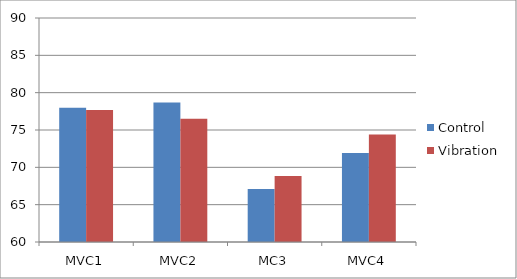
| Category | Control | Vibration |
|---|---|---|
| MVC1 | 77.965 | 77.668 |
| MVC2 | 78.669 | 76.519 |
| MC3 | 67.1 | 68.825 |
| MVC4 | 71.932 | 74.404 |